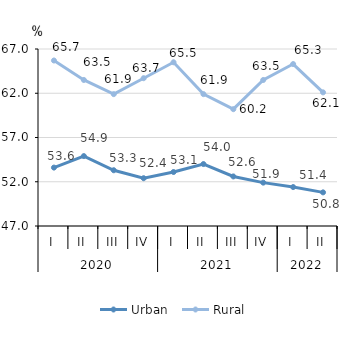
| Category | Urban | Rural |
|---|---|---|
| 0 | 53.6 | 65.7 |
| 1 | 54.9 | 63.5 |
| 2 | 53.3 | 61.9 |
| 3 | 52.4 | 63.7 |
| 4 | 53.1 | 65.5 |
| 5 | 54 | 61.9 |
| 6 | 52.6 | 60.2 |
| 7 | 51.9 | 63.5 |
| 8 | 51.4 | 65.3 |
| 9 | 50.8 | 62.1 |